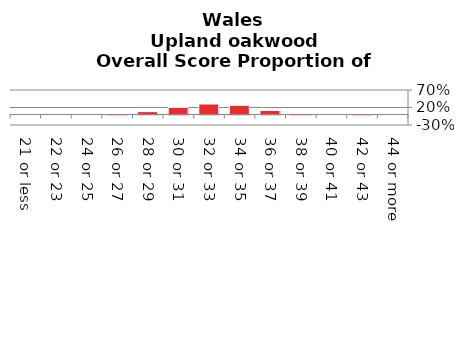
| Category | Upland oakwood |
|---|---|
| 21 or less | 0 |
| 22 or 23 | 0 |
| 24 or 25 | 0 |
| 26 or 27 | 0.01 |
| 28 or 29 | 0.082 |
| 30 or 31 | 0.204 |
| 32 or 33 | 0.3 |
| 34 or 35 | 0.263 |
| 36 or 37 | 0.117 |
| 38 or 39 | 0.022 |
| 40 or 41 | 0 |
| 42 or 43 | 0.003 |
| 44 or more | 0 |